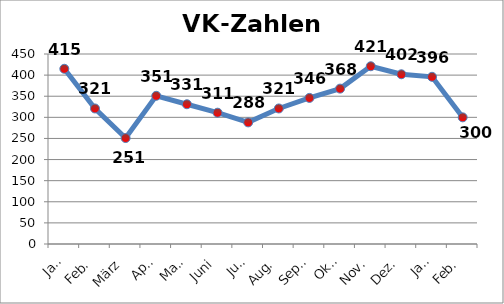
| Category | VK-Zahlen |
|---|---|
| Jan. | 415 |
| Feb. | 321 |
| März | 251 |
| Apr. | 351 |
| Mai. | 331 |
| Juni | 311 |
| Juli | 288 |
| Aug. | 321 |
| Sept. | 346 |
| Okt. | 368 |
| Nov. | 421 |
| Dez. | 402 |
| Jan. | 396 |
| Feb. | 300 |